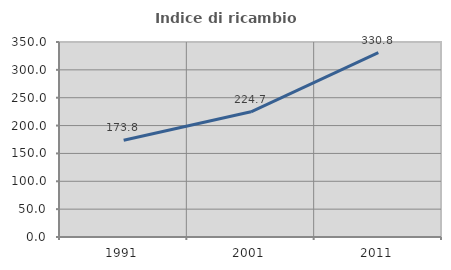
| Category | Indice di ricambio occupazionale  |
|---|---|
| 1991.0 | 173.759 |
| 2001.0 | 224.675 |
| 2011.0 | 330.769 |